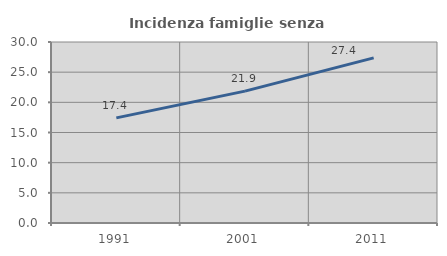
| Category | Incidenza famiglie senza nuclei |
|---|---|
| 1991.0 | 17.426 |
| 2001.0 | 21.862 |
| 2011.0 | 27.374 |